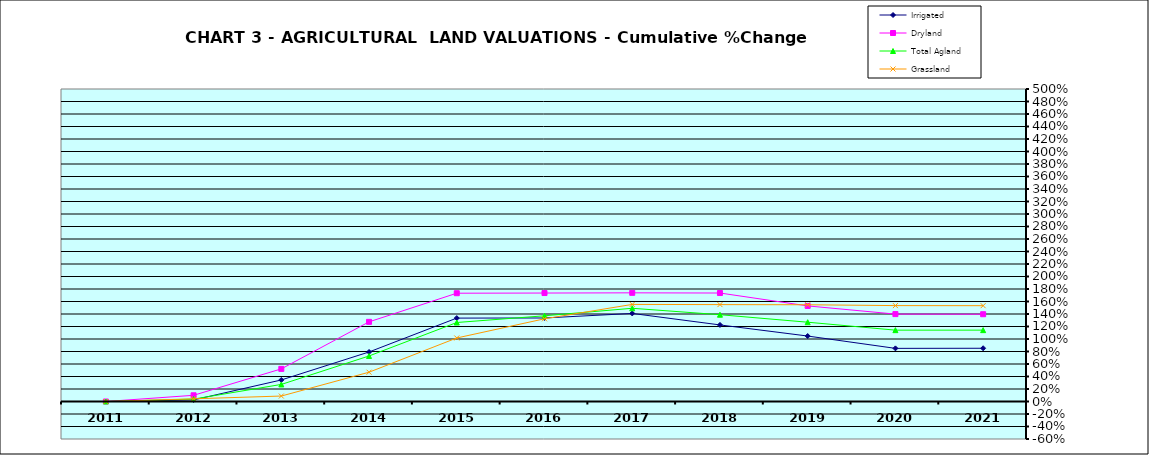
| Category | Irrigated | Dryland | Total Agland | Grassland |
|---|---|---|---|---|
| 2011.0 | 0 | 0 | 0 | 0 |
| 2012.0 | 0.025 | 0.099 | 0.039 | 0.043 |
| 2013.0 | 0.345 | 0.522 | 0.273 | 0.087 |
| 2014.0 | 0.792 | 1.274 | 0.728 | 0.469 |
| 2015.0 | 1.334 | 1.733 | 1.264 | 1.016 |
| 2016.0 | 1.336 | 1.735 | 1.371 | 1.323 |
| 2017.0 | 1.409 | 1.739 | 1.492 | 1.553 |
| 2018.0 | 1.225 | 1.736 | 1.389 | 1.55 |
| 2019.0 | 1.047 | 1.529 | 1.269 | 1.548 |
| 2020.0 | 0.85 | 1.398 | 1.142 | 1.534 |
| 2021.0 | 0.852 | 1.396 | 1.142 | 1.533 |